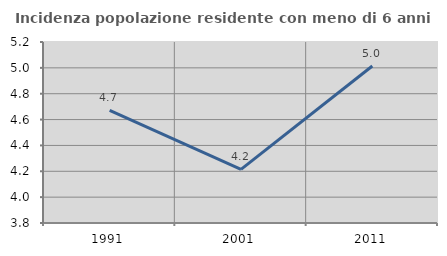
| Category | Incidenza popolazione residente con meno di 6 anni |
|---|---|
| 1991.0 | 4.672 |
| 2001.0 | 4.215 |
| 2011.0 | 5.015 |